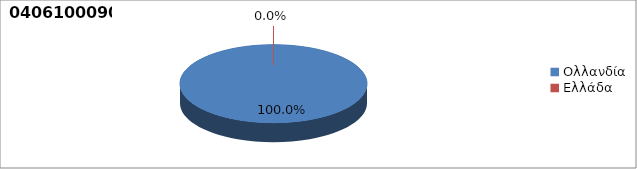
| Category | Series 0 |
|---|---|
| Ολλανδία | 1 |
| Ελλάδα | 0 |